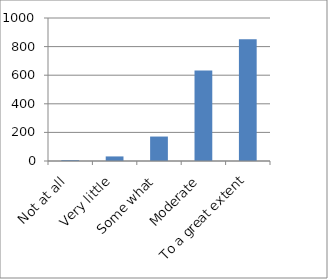
| Category | Series 0 |
|---|---|
| Not at all | 6 |
| Very little | 32 |
| Some what | 171 |
|  Moderate | 632 |
| To a great extent | 852 |